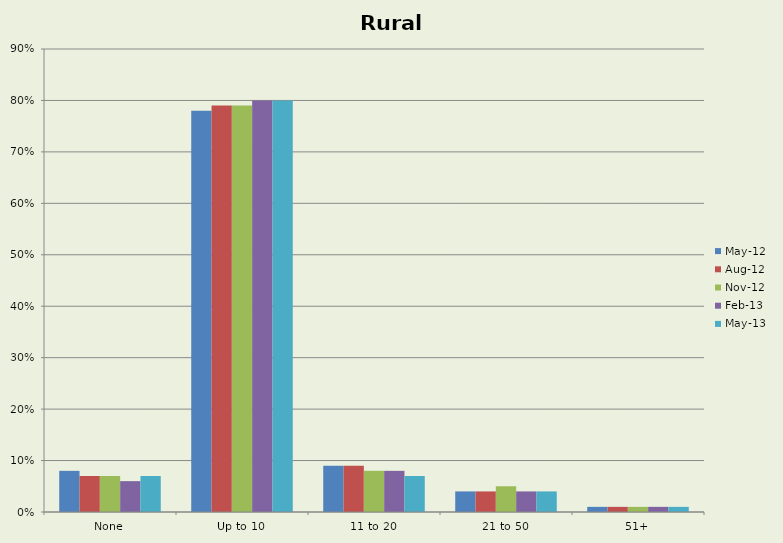
| Category | May-12 | Aug-12 | Nov-12 | Feb-13 | May-13 |
|---|---|---|---|---|---|
| None | 0.08 | 0.07 | 0.07 | 0.06 | 0.07 |
| Up to 10 | 0.78 | 0.79 | 0.79 | 0.8 | 0.8 |
| 11 to 20 | 0.09 | 0.09 | 0.08 | 0.08 | 0.07 |
| 21 to 50 | 0.04 | 0.04 | 0.05 | 0.04 | 0.04 |
| 51+ | 0.01 | 0.01 | 0.01 | 0.01 | 0.01 |